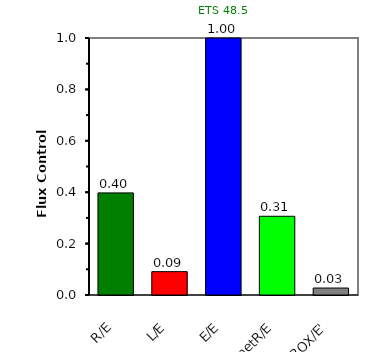
| Category | ETS 48,5 |
|---|---|
| R/E | 0.397 |
| L/E | 0.091 |
| E/E | 1 |
| netR/E | 0.306 |
| ROX/E' | 0.027 |